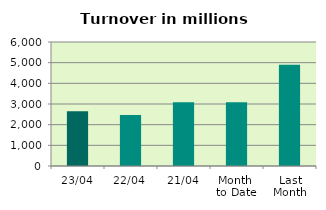
| Category | Series 0 |
|---|---|
| 23/04 | 2650.54 |
| 22/04 | 2466.649 |
| 21/04 | 3090.43 |
| Month 
to Date | 3086.904 |
| Last
Month | 4897.629 |